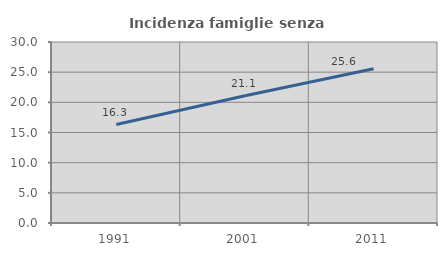
| Category | Incidenza famiglie senza nuclei |
|---|---|
| 1991.0 | 16.325 |
| 2001.0 | 21.095 |
| 2011.0 | 25.554 |